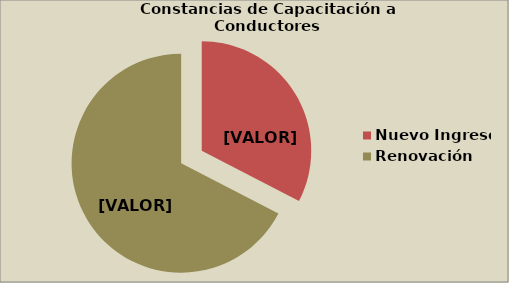
| Category | Series 0 |
|---|---|
| Nuevo Ingreso | 32.597 |
| Renovación | 67.403 |